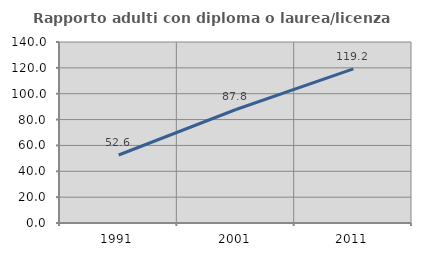
| Category | Rapporto adulti con diploma o laurea/licenza media  |
|---|---|
| 1991.0 | 52.603 |
| 2001.0 | 87.794 |
| 2011.0 | 119.231 |